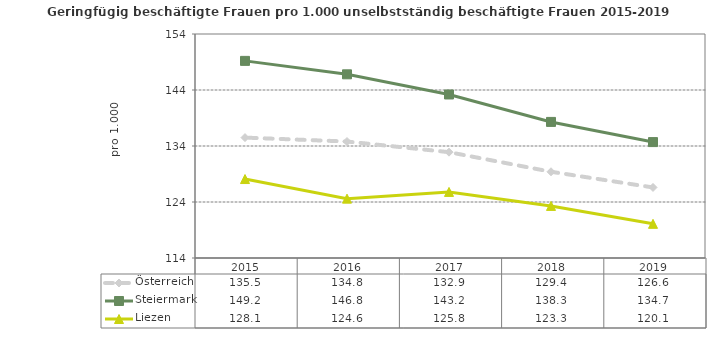
| Category | Österreich | Steiermark | Liezen |
|---|---|---|---|
| 2019.0 | 126.6 | 134.7 | 120.1 |
| 2018.0 | 129.4 | 138.3 | 123.3 |
| 2017.0 | 132.9 | 143.2 | 125.8 |
| 2016.0 | 134.8 | 146.8 | 124.6 |
| 2015.0 | 135.5 | 149.2 | 128.1 |